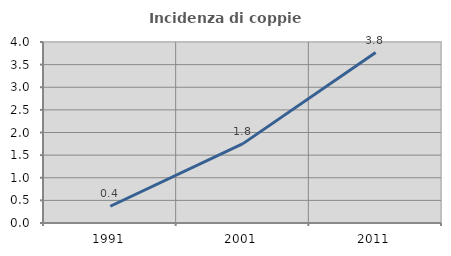
| Category | Incidenza di coppie miste |
|---|---|
| 1991.0 | 0.37 |
| 2001.0 | 1.754 |
| 2011.0 | 3.767 |